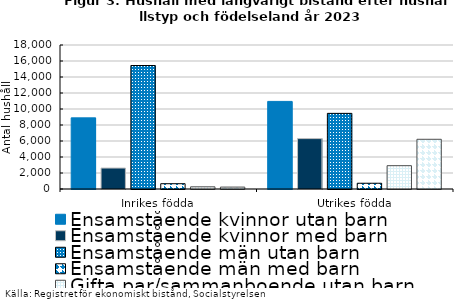
| Category | Ensamstående kvinnor utan barn | Ensamstående kvinnor med barn | Ensamstående män utan barn | Ensamstående män med barn | Gifta par/sammanboende utan barn | Gifta par/sammanboende med barn |
|---|---|---|---|---|---|---|
| Inrikes födda | 8892 | 2621 | 15437 | 662 | 273 | 239 |
| Utrikes födda | 10949 | 6300 | 9455 | 719 | 2915 | 6214 |